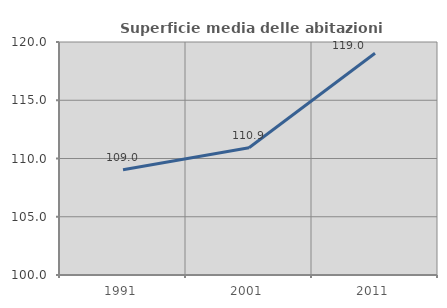
| Category | Superficie media delle abitazioni occupate |
|---|---|
| 1991.0 | 109.026 |
| 2001.0 | 110.929 |
| 2011.0 | 119.032 |